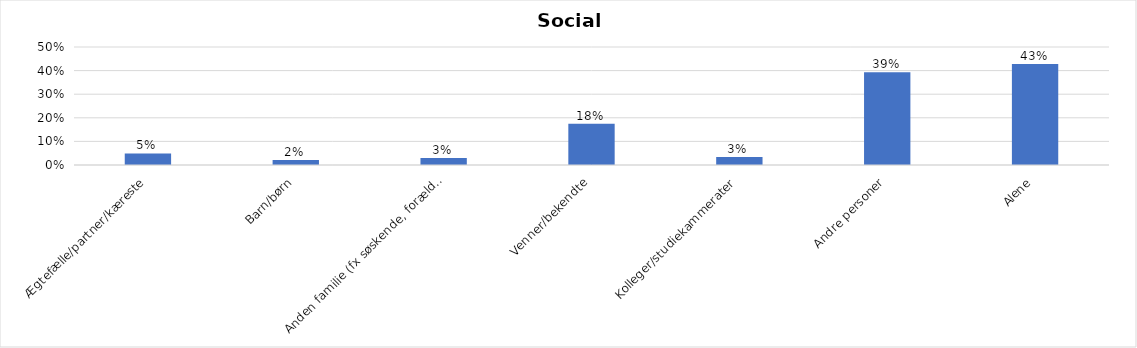
| Category | % |
|---|---|
| Ægtefælle/partner/kæreste | 0.049 |
| Barn/børn | 0.021 |
| Anden familie (fx søskende, forældre) | 0.03 |
| Venner/bekendte | 0.175 |
| Kolleger/studiekammerater | 0.034 |
| Andre personer | 0.393 |
| Alene | 0.428 |